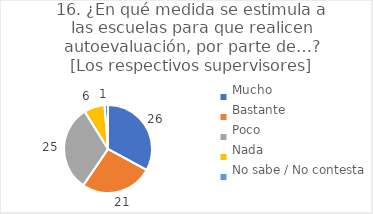
| Category | 16. ¿En qué medida se estimula a las escuelas para que realicen autoevaluación, por parte de…?
[Los respectivos supervisores] |
|---|---|
| Mucho  | 0.329 |
| Bastante  | 0.266 |
| Poco  | 0.316 |
| Nada  | 0.076 |
| No sabe / No contesta | 0.013 |